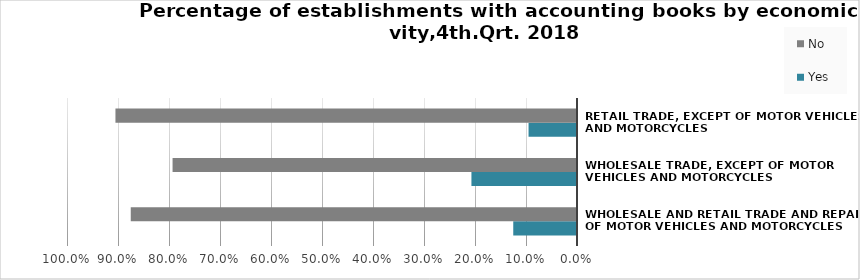
| Category | Yes | No |
|---|---|---|
| Wholesale and retail trade and repair of motor vehicles and motorcycles | 0.125 | 0.875 |
| Wholesale trade, except of motor vehicles and motorcycles | 0.207 | 0.793 |
| Retail trade, except of motor vehicles and motorcycles | 0.095 | 0.905 |